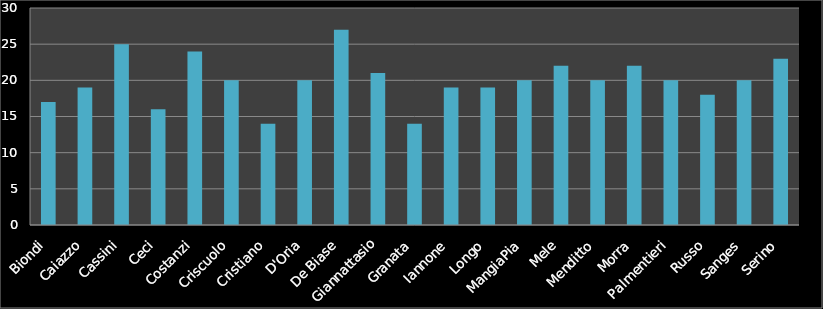
| Category | Series 0 |
|---|---|
| Biondi | 17 |
| Caiazzo | 19 |
| Cassini | 25 |
| Ceci | 16 |
| Costanzi | 24 |
| Criscuolo | 20 |
| Cristiano | 14 |
| D'Oria | 20 |
| De Biase | 27 |
| Giannattasio | 21 |
| Granata | 14 |
| Iannone | 19 |
| Longo | 19 |
| MangiaPia | 20 |
| Mele | 22 |
| Menditto | 20 |
| Morra | 22 |
| Palmentieri | 20 |
| Russo | 18 |
| Sanges | 20 |
| Serino | 23 |